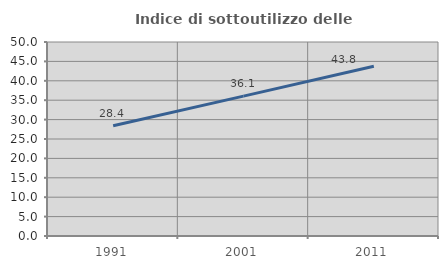
| Category | Indice di sottoutilizzo delle abitazioni  |
|---|---|
| 1991.0 | 28.409 |
| 2001.0 | 36.052 |
| 2011.0 | 43.756 |